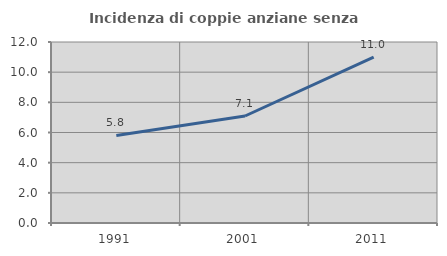
| Category | Incidenza di coppie anziane senza figli  |
|---|---|
| 1991.0 | 5.803 |
| 2001.0 | 7.094 |
| 2011.0 | 10.998 |